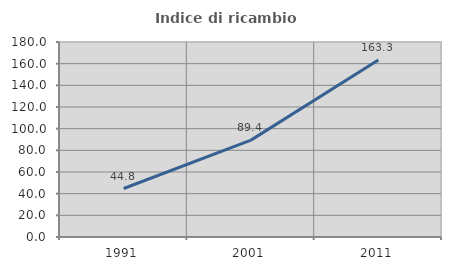
| Category | Indice di ricambio occupazionale  |
|---|---|
| 1991.0 | 44.751 |
| 2001.0 | 89.433 |
| 2011.0 | 163.3 |